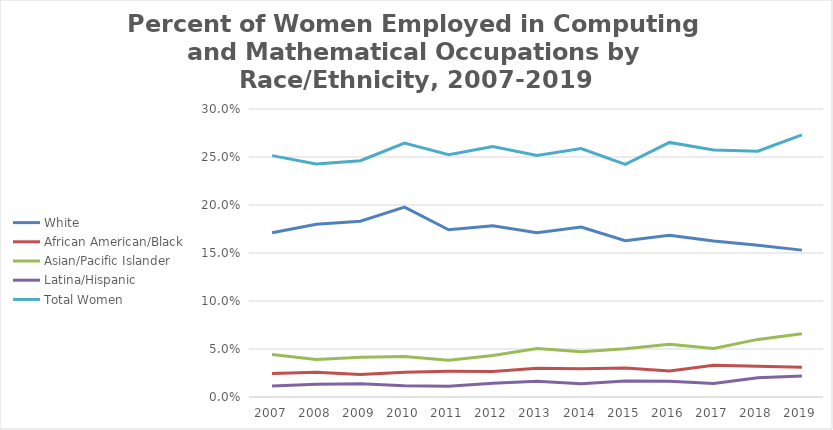
| Category | White | African American/Black | Asian/Pacific Islander | Latina/Hispanic | Total Women |
|---|---|---|---|---|---|
| 2007 | 0.171 | 0.024 | 0.044 | 0.012 | 0.251 |
| 2008 | 0.18 | 0.026 | 0.039 | 0.013 | 0.243 |
| 2009 | 0.183 | 0.023 | 0.041 | 0.014 | 0.246 |
| 2010 | 0.198 | 0.026 | 0.042 | 0.012 | 0.265 |
| 2011 | 0.174 | 0.027 | 0.038 | 0.011 | 0.252 |
| 2012 | 0.178 | 0.027 | 0.043 | 0.014 | 0.261 |
| 2013 | 0.171 | 0.03 | 0.051 | 0.016 | 0.252 |
| 2014 | 0.177 | 0.029 | 0.047 | 0.014 | 0.259 |
| 2015 | 0.163 | 0.03 | 0.05 | 0.017 | 0.242 |
| 2016 | 0.169 | 0.027 | 0.055 | 0.016 | 0.265 |
| 2017 | 0.163 | 0.033 | 0.051 | 0.014 | 0.257 |
| 2018 | 0.158 | 0.032 | 0.06 | 0.02 | 0.256 |
| 2019 | 0.153 | 0.031 | 0.066 | 0.022 | 0.273 |